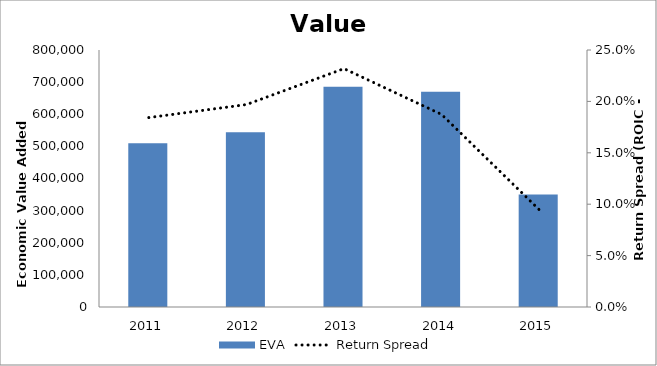
| Category | EVA |
|---|---|
| 2011.0 | 509460.075 |
| 2012.0 | 543673.205 |
| 2013.0 | 685248.325 |
| 2014.0 | 670246.133 |
| 2015.0 | 349927.176 |